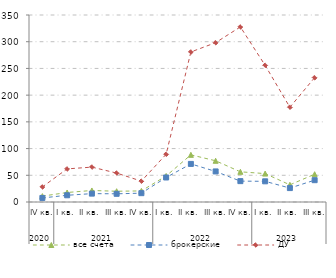
| Category | все счета | брокерские | ДУ |
|---|---|---|---|
| 0 | 10.982 | 7.62 | 28.211 |
| 1 | 17.801 | 12.579 | 61.961 |
| 2 | 21.579 | 15.682 | 65.296 |
| 3 | 20.135 | 15.326 | 54.143 |
| 4 | 20.765 | 16.551 | 39.05 |
| 5 | 48.734 | 45.876 | 89.34 |
| 6 | 88.25 | 71.295 | 280.806 |
| 7 | 77.135 | 57.209 | 298.221 |
| 8 | 56.491 | 39.065 | 327.725 |
| 9 | 53.155 | 38.706 | 255.799 |
| 10 | 32.128 | 26.045 | 177.312 |
| 11 | 51.976 | 40.83 | 232.743 |